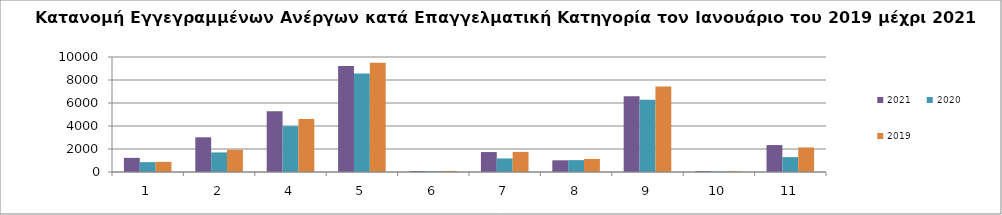
| Category | 2021 | 2020 | 2019 |
|---|---|---|---|
| 1.0 | 1229 | 857 | 880 |
| 2.0 | 3018 | 1702 | 1931 |
| 4.0 | 5289 | 3980 | 4611 |
| 5.0 | 9212 | 8556 | 9498 |
| 6.0 | 83 | 61 | 92 |
| 7.0 | 1736 | 1179 | 1746 |
| 8.0 | 1017 | 1033 | 1136 |
| 9.0 | 6590 | 6279 | 7430 |
| 10.0 | 81 | 46 | 74 |
| 11.0 | 2343 | 1294 | 2136 |